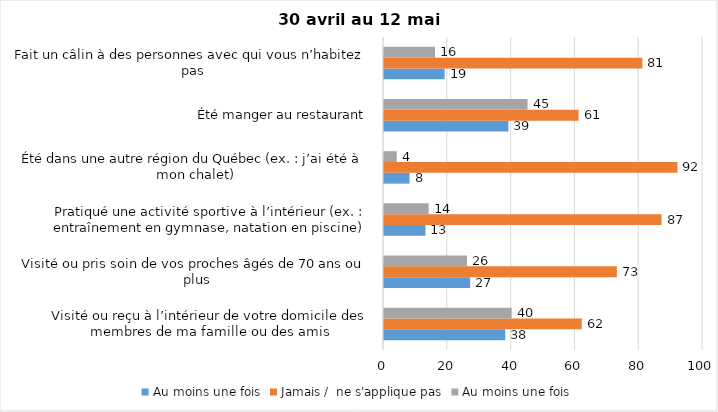
| Category | Au moins une fois | Jamais /  ne s'applique pas |
|---|---|---|
| Visité ou reçu à l’intérieur de votre domicile des membres de ma famille ou des amis | 40 | 62 |
| Visité ou pris soin de vos proches âgés de 70 ans ou plus | 26 | 73 |
| Pratiqué une activité sportive à l’intérieur (ex. : entraînement en gymnase, natation en piscine) | 14 | 87 |
| Été dans une autre région du Québec (ex. : j’ai été à mon chalet) | 4 | 92 |
| Été manger au restaurant | 45 | 61 |
| Fait un câlin à des personnes avec qui vous n’habitez pas | 16 | 81 |